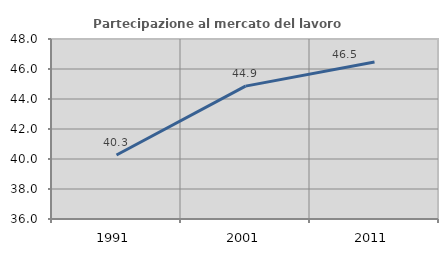
| Category | Partecipazione al mercato del lavoro  femminile |
|---|---|
| 1991.0 | 40.264 |
| 2001.0 | 44.859 |
| 2011.0 | 46.471 |